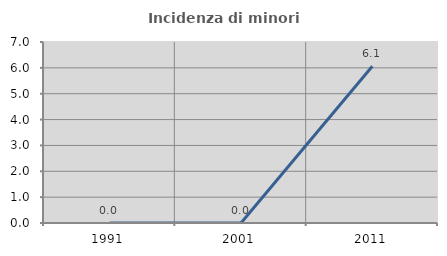
| Category | Incidenza di minori stranieri |
|---|---|
| 1991.0 | 0 |
| 2001.0 | 0 |
| 2011.0 | 6.061 |